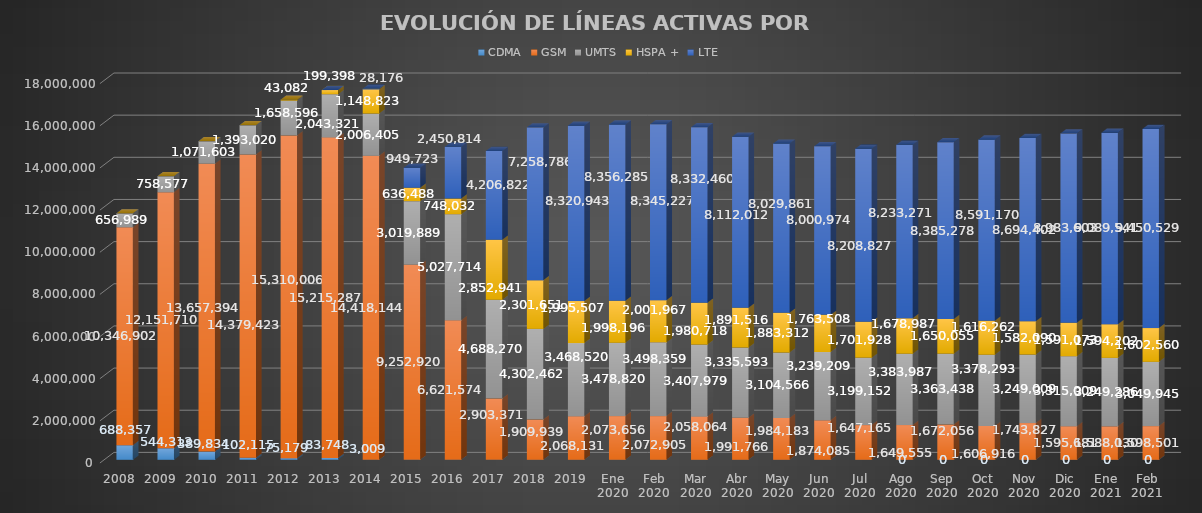
| Category | CDMA | GSM | UMTS | HSPA + | LTE |
|---|---|---|---|---|---|
| 2008 | 688357 | 10346902 | 656989 | 0 | 0 |
| 2009 | 544313 | 12151710 | 758577 | 0 | 0 |
| 2010 | 389834 | 13657394 | 1071603 | 0 | 0 |
| 2011 | 102115 | 14379423 | 1393020 | 0 | 0 |
| 2012 | 75179 | 15310006 | 1658596 | 43082 | 0 |
| 2013 | 83748 | 15215287 | 2043321 | 199398 | 0 |
| 2014 | 3009 | 14418144 | 2006405 | 1148823 | 28176 |
| 2015 | 0 | 9252920 | 3019889 | 636488 | 949723 |
| 2016 | 0 | 6621574 | 5027714 | 748032 | 2450814 |
| 2017 | 0 | 2903370.634 | 4688270.066 | 2852941.199 | 4206822.101 |
| 2018 | 0 | 1909938.891 | 4302462.415 | 2301651 | 7258785.694 |
| 2019 | 0 | 2068130.505 | 3468519.705 | 1995507 | 8320942.79 |
| Ene 2020 | 0 | 2073655.568 | 3478820.178 | 1998196 | 8356285.254 |
| Feb 2020 | 0 | 2072904.519 | 3498359.253 | 2001967 | 8345227.229 |
| Mar 2020 | 0 | 2058064.417 | 3407979.081 | 1980718 | 8332459.502 |
| Abr 2020 | 0 | 1991765.546 | 3335592.93 | 1891516 | 8112011.524 |
| May 2020 | 0 | 1984182.941 | 3104565.638 | 1883312 | 8029861.421 |
| Jun 2020 | 0 | 1874085.045 | 3239208.945 | 1763508 | 8000974.011 |
| Jul 2020 | 0 | 1647164.681 | 3199151.558 | 1701928 | 8208826.761 |
| Ago 2020 | 0 | 1649555.106 | 3383987.03 | 1678987 | 8233270.864 |
| Sep 2020 | 0 | 1672055.632 | 3363437.797 | 1650055 | 8385277.572 |
| Oct 2020 | 0 | 1606916.453 | 3378292.838 | 1616262 | 8591169.708 |
| Nov 2020 | 0 | 1743826.763 | 3249009.433 | 1582090 | 8694401.804 |
| Dic 2020 | 0 | 1595680.621 | 3315009.099 | 1591073 | 8983603.28 |
| Ene 2021 | 0 | 1588029.73 | 3249285.841 | 1594202 | 9089541.428 |
| Feb 2021 | 0 | 1598501 | 3049945 | 1602560 | 9450529 |